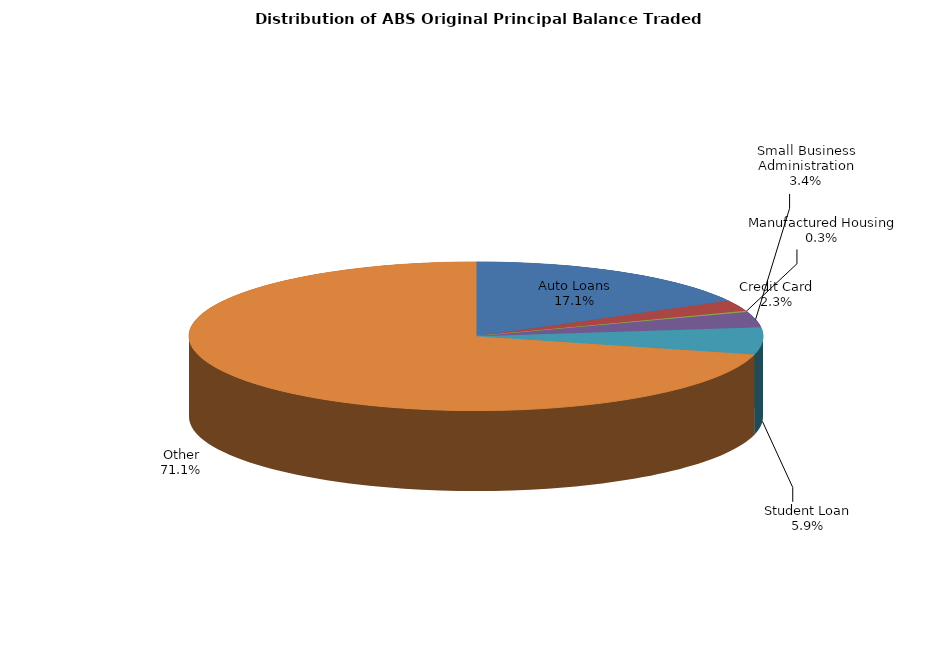
| Category | Series 0 |
|---|---|
| Auto Loans | 389750733.438 |
| Credit Card | 52859180.478 |
| Manufactured Housing | 6885424.359 |
| Small Business Administration | 76818803.171 |
| Student Loan | 134473814.574 |
| Other | 1621790783.27 |